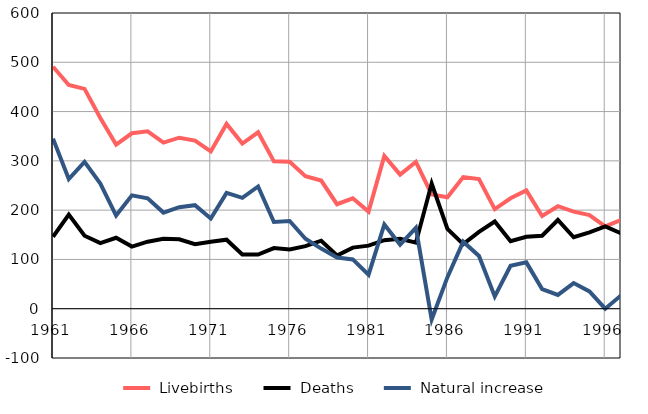
| Category |  Livebirths |  Deaths |  Natural increase |
|---|---|---|---|
| 1961.0 | 491 | 146 | 345 |
| 1962.0 | 454 | 191 | 263 |
| 1963.0 | 446 | 148 | 298 |
| 1964.0 | 387 | 133 | 254 |
| 1965.0 | 333 | 144 | 189 |
| 1966.0 | 356 | 126 | 230 |
| 1967.0 | 360 | 136 | 224 |
| 1968.0 | 337 | 142 | 195 |
| 1969.0 | 347 | 141 | 206 |
| 1970.0 | 341 | 131 | 210 |
| 1971.0 | 319 | 136 | 183 |
| 1972.0 | 375 | 140 | 235 |
| 1973.0 | 335 | 110 | 225 |
| 1974.0 | 358 | 110 | 248 |
| 1975.0 | 299 | 123 | 176 |
| 1976.0 | 298 | 120 | 178 |
| 1977.0 | 269 | 127 | 142 |
| 1978.0 | 260 | 138 | 122 |
| 1979.0 | 212 | 108 | 104 |
| 1980.0 | 224 | 124 | 100 |
| 1981.0 | 197 | 128 | 69 |
| 1982.0 | 310 | 139 | 171 |
| 1983.0 | 272 | 142 | 130 |
| 1984.0 | 298 | 134 | 164 |
| 1985.0 | 232 | 254 | -22 |
| 1986.0 | 226 | 162 | 64 |
| 1987.0 | 267 | 131 | 136 |
| 1988.0 | 263 | 156 | 107 |
| 1989.0 | 202 | 177 | 25 |
| 1990.0 | 224 | 137 | 87 |
| 1991.0 | 240 | 146 | 94 |
| 1992.0 | 188 | 148 | 40 |
| 1993.0 | 208 | 180 | 28 |
| 1994.0 | 197 | 145 | 52 |
| 1995.0 | 190 | 155 | 35 |
| 1996.0 | 167 | 167 | 0 |
| 1997.0 | 180 | 153 | 27 |